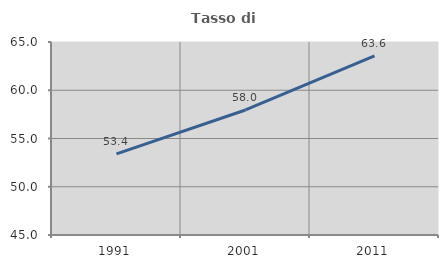
| Category | Tasso di occupazione   |
|---|---|
| 1991.0 | 53.413 |
| 2001.0 | 57.958 |
| 2011.0 | 63.562 |